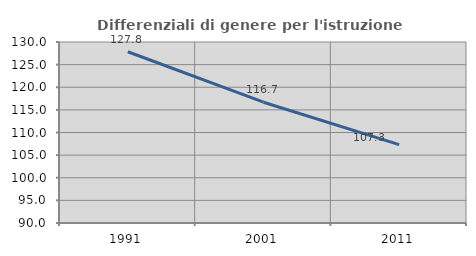
| Category | Differenziali di genere per l'istruzione superiore |
|---|---|
| 1991.0 | 127.846 |
| 2001.0 | 116.692 |
| 2011.0 | 107.323 |